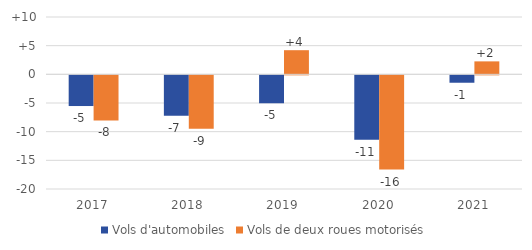
| Category | Vols d'automobiles | Vols de deux roues motorisés |
|---|---|---|
| 2017.0 | -5.355 | -7.866 |
| 2018.0 | -7.062 | -9.304 |
| 2019.0 | -4.87 | 4.211 |
| 2020.0 | -11.237 | -16.429 |
| 2021.0 | -1.292 | 2.26 |